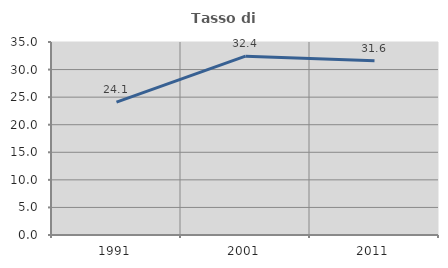
| Category | Tasso di occupazione   |
|---|---|
| 1991.0 | 24.102 |
| 2001.0 | 32.427 |
| 2011.0 | 31.615 |